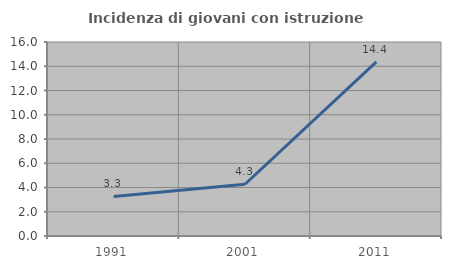
| Category | Incidenza di giovani con istruzione universitaria |
|---|---|
| 1991.0 | 3.261 |
| 2001.0 | 4.268 |
| 2011.0 | 14.362 |